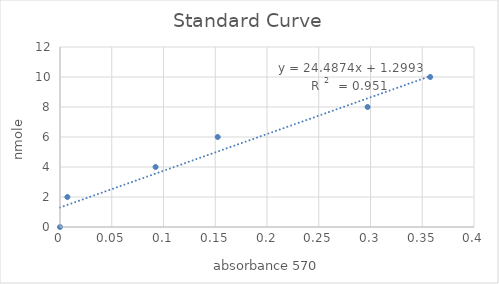
| Category | Series 0 |
|---|---|
| 0.0 | 0 |
| 0.007150000000000101 | 2 |
| 0.09235000000000004 | 4 |
| 0.15239999999999998 | 6 |
| 0.2972 | 8 |
| 0.3576499999999999 | 10 |